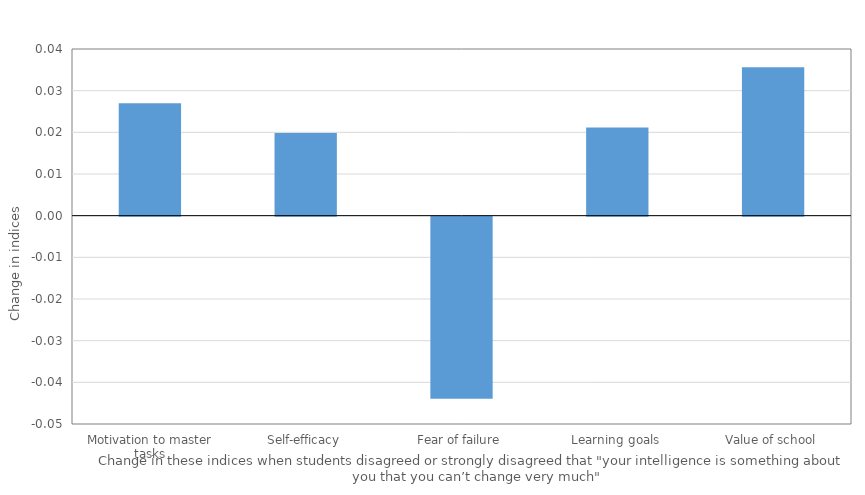
| Category | Series 2 |
|---|---|
| Motivation to master tasks | 0.027 |
| Self-efficacy | 0.02 |
| Fear of failure | -0.044 |
| Learning goals | 0.021 |
| Value of school | 0.036 |